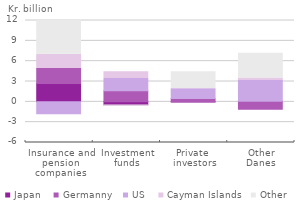
| Category | Japan | Germanny | US | Cayman Islands | Other |
|---|---|---|---|---|---|
| Insurance and pension companies | 2.713 | 2.198 | -1.75 | 2.106 | 5.826 |
| Investment
funds | -0.477 | 1.631 | 1.827 | 0.977 | -0.162 |
| Private 
investors | -0.035 | 0.507 | 1.435 | 0.023 | 2.468 |
| Other
Danes | 0.102 | -1.092 | 3.058 | 0.351 | 3.641 |